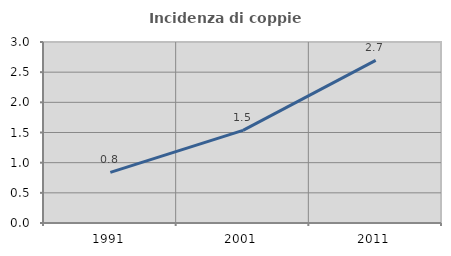
| Category | Incidenza di coppie miste |
|---|---|
| 1991.0 | 0.839 |
| 2001.0 | 1.534 |
| 2011.0 | 2.695 |